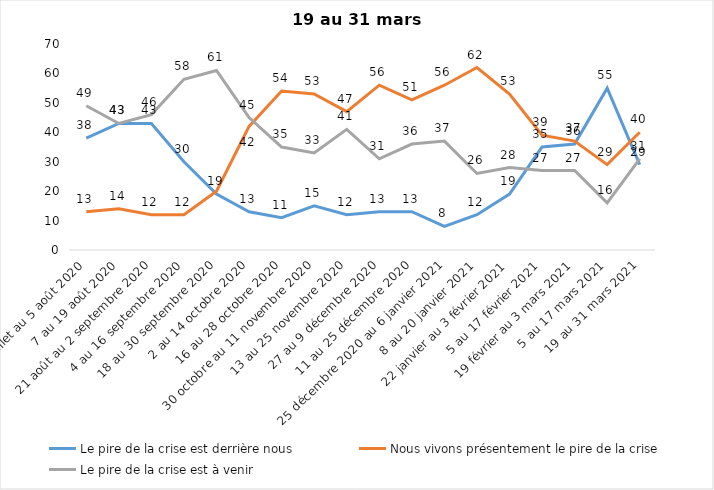
| Category | Le pire de la crise est derrière nous | Nous vivons présentement le pire de la crise | Le pire de la crise est à venir |
|---|---|---|---|
| 24 juillet au 5 août 2020 | 38 | 13 | 49 |
| 7 au 19 août 2020 | 43 | 14 | 43 |
| 21 août au 2 septembre 2020 | 43 | 12 | 46 |
| 4 au 16 septembre 2020 | 30 | 12 | 58 |
| 18 au 30 septembre 2020 | 19 | 20 | 61 |
| 2 au 14 octobre 2020 | 13 | 42 | 45 |
| 16 au 28 octobre 2020 | 11 | 54 | 35 |
| 30 octobre au 11 novembre 2020 | 15 | 53 | 33 |
| 13 au 25 novembre 2020 | 12 | 47 | 41 |
| 27 au 9 décembre 2020 | 13 | 56 | 31 |
| 11 au 25 décembre 2020 | 13 | 51 | 36 |
| 25 décembre 2020 au 6 janvier 2021 | 8 | 56 | 37 |
| 8 au 20 janvier 2021 | 12 | 62 | 26 |
| 22 janvier au 3 février 2021 | 19 | 53 | 28 |
| 5 au 17 février 2021 | 35 | 39 | 27 |
| 19 février au 3 mars 2021 | 36 | 37 | 27 |
| 5 au 17 mars 2021 | 55 | 29 | 16 |
| 19 au 31 mars 2021 | 29 | 40 | 31 |